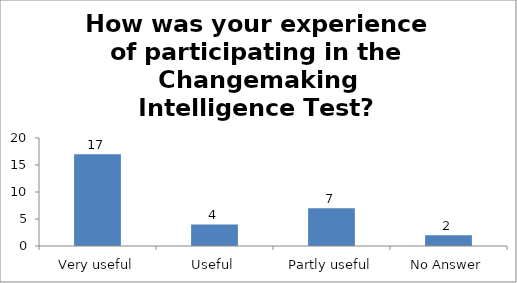
| Category | How was your experience of participating in the Changemaking Intelligence Test? |
|---|---|
| Very useful | 17 |
| Useful | 4 |
| Partly useful | 7 |
| No Answer | 2 |